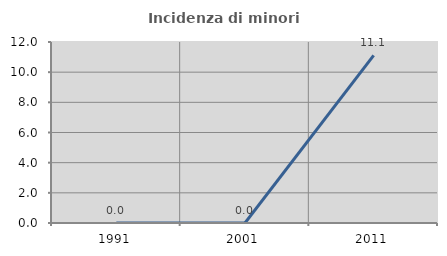
| Category | Incidenza di minori stranieri |
|---|---|
| 1991.0 | 0 |
| 2001.0 | 0 |
| 2011.0 | 11.111 |